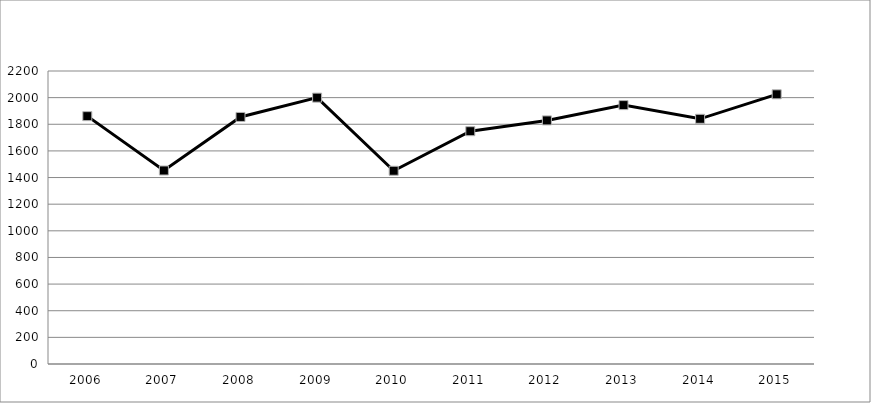
| Category | Series 1 |
|---|---|
| 2006.0 | 1861 |
| 2007.0 | 1453 |
| 2008.0 | 1855 |
| 2009.0 | 2000 |
| 2010.0 | 1451 |
| 2011.0 | 1748 |
| 2012.0 | 1829 |
| 2013.0 | 1944 |
| 2014.0 | 1841 |
| 2015.0 | 2025 |